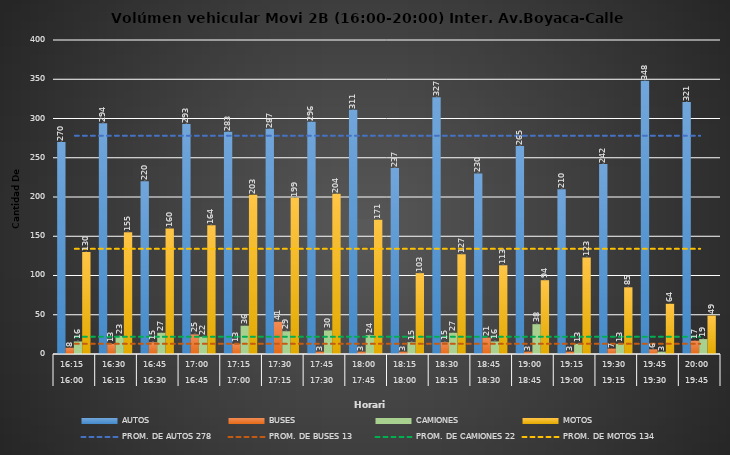
| Category | AUTOS | BUSES | CAMIONES | MOTOS |
|---|---|---|---|---|
| 0 | 270 | 8 | 16 | 130 |
| 1 | 294 | 13 | 23 | 155 |
| 2 | 220 | 15 | 27 | 160 |
| 3 | 293 | 25 | 22 | 164 |
| 4 | 283 | 13 | 36 | 203 |
| 5 | 287 | 41 | 29 | 199 |
| 6 | 296 | 3 | 30 | 204 |
| 7 | 311 | 3 | 24 | 171 |
| 8 | 237 | 3 | 15 | 103 |
| 9 | 327 | 15 | 27 | 127 |
| 10 | 230 | 21 | 16 | 113 |
| 11 | 265 | 3 | 38 | 94 |
| 12 | 210 | 3 | 13 | 123 |
| 13 | 242 | 7 | 13 | 85 |
| 14 | 348 | 6 | 3 | 64 |
| 15 | 321 | 17 | 19 | 49 |